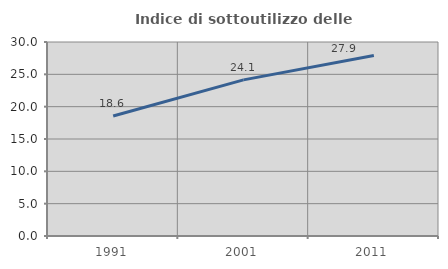
| Category | Indice di sottoutilizzo delle abitazioni  |
|---|---|
| 1991.0 | 18.558 |
| 2001.0 | 24.141 |
| 2011.0 | 27.908 |